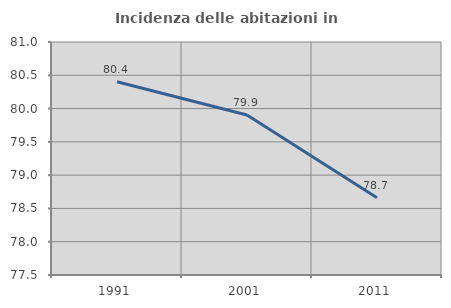
| Category | Incidenza delle abitazioni in proprietà  |
|---|---|
| 1991.0 | 80.402 |
| 2001.0 | 79.904 |
| 2011.0 | 78.66 |